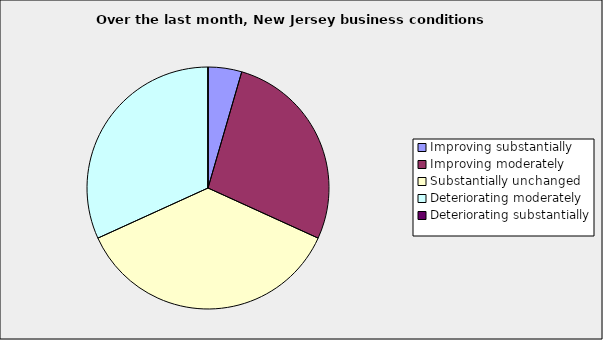
| Category | Series 0 |
|---|---|
| Improving substantially | 0.045 |
| Improving moderately | 0.273 |
| Substantially unchanged | 0.364 |
| Deteriorating moderately | 0.318 |
| Deteriorating substantially | 0 |